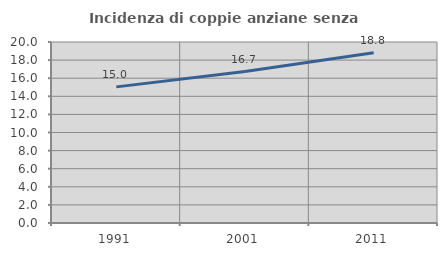
| Category | Incidenza di coppie anziane senza figli  |
|---|---|
| 1991.0 | 15.041 |
| 2001.0 | 16.735 |
| 2011.0 | 18.824 |